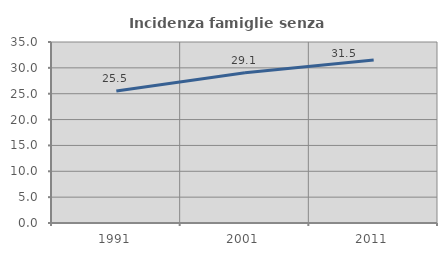
| Category | Incidenza famiglie senza nuclei |
|---|---|
| 1991.0 | 25.514 |
| 2001.0 | 29.07 |
| 2011.0 | 31.497 |